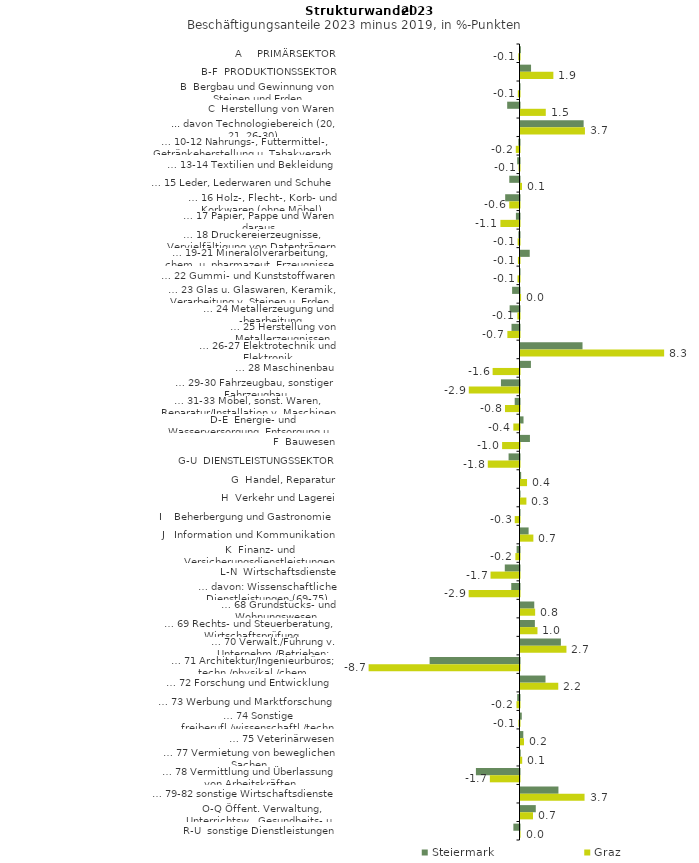
| Category | Steiermark | Graz |
|---|---|---|
| A     PRIMÄRSEKTOR | 0.022 | -0.067 |
| B-F  PRODUKTIONSSEKTOR | 0.612 | 1.905 |
| B  Bergbau und Gewinnung von Steinen und Erden | -0.009 | -0.097 |
| C  Herstellung von Waren | -0.714 | 1.466 |
| ... davon Technologiebereich (20, 21, 26-30) | 3.66 | 3.736 |
| … 10-12 Nahrungs-, Futtermittel-, Getränkeherstellung u. Tabakverarb. | -0.068 | -0.215 |
| … 13-14 Textilien und Bekleidung | -0.134 | -0.053 |
| … 15 Leder, Lederwaren und Schuhe | -0.593 | 0.089 |
| … 16 Holz-, Flecht-, Korb- und Korkwaren (ohne Möbel)  | -0.83 | -0.596 |
| … 17 Papier, Pappe und Waren daraus  | -0.208 | -1.107 |
| … 18 Druckereierzeugnisse, Vervielfältigung von Datenträgern | -0.063 | -0.106 |
| … 19-21 Mineralölverarbeitung, chem. u. pharmazeut. Erzeugnisse | 0.535 | -0.092 |
| … 22 Gummi- und Kunststoffwaren | -0.02 | -0.115 |
| … 23 Glas u. Glaswaren, Keramik, Verarbeitung v. Steinen u. Erden  | -0.429 | 0.032 |
| … 24 Metallerzeugung und -bearbeitung | -0.572 | -0.124 |
| … 25 Herstellung von Metallerzeugnissen  | -0.464 | -0.704 |
| … 26-27 Elektrotechnik und Elektronik | 3.595 | 8.327 |
| … 28 Maschinenbau | 0.604 | -1.558 |
| … 29-30 Fahrzeugbau, sonstiger Fahrzeugbau | -1.076 | -2.939 |
| … 31-33 Möbel, sonst. Waren, Reparatur/Installation v. Maschinen | -0.279 | -0.839 |
| D-E  Energie- und Wasserversorgung, Entsorgung u. Rückgewinnung | 0.175 | -0.358 |
| F  Bauwesen | 0.547 | -1.009 |
| G-U  DIENSTLEISTUNGSSEKTOR | -0.633 | -1.838 |
| G  Handel, Reparatur | 0.038 | 0.379 |
| H  Verkehr und Lagerei | -0.011 | 0.342 |
| I    Beherbergung und Gastronomie | -0.007 | -0.275 |
| J   Information und Kommunikation | 0.471 | 0.746 |
| K  Finanz- und Versicherungsdienstleistungen | -0.168 | -0.24 |
| L-N  Wirtschaftsdienste | -0.853 | -1.679 |
| … davon: Wissenschaftliche Dienstleistungen (69-75) | -0.478 | -2.948 |
| … 68 Grundstücks- und Wohnungswesen  | 0.798 | 0.849 |
| … 69 Rechts- und Steuerberatung, Wirtschaftsprüfung | 0.834 | 0.984 |
| … 70 Verwalt./Führung v. Unternehm./Betrieben; Unternehmensberat. | 2.342 | 2.663 |
| … 71 Architektur/Ingenieurbüros; techn./physikal./chem. Untersuchung | -5.212 | -8.747 |
| … 72 Forschung und Entwicklung  | 1.449 | 2.189 |
| … 73 Werbung und Marktforschung | -0.133 | -0.174 |
| … 74 Sonstige freiberufl./wissenschaftl./techn. Tätigkeiten | 0.074 | -0.062 |
| … 75 Veterinärwesen | 0.163 | 0.202 |
| … 77 Vermietung von beweglichen Sachen  | 0.011 | 0.099 |
| … 78 Vermittlung und Überlassung von Arbeitskräften | -2.527 | -1.719 |
| … 79-82 sonstige Wirtschaftsdienste | 2.199 | 3.713 |
| O-Q Öffent. Verwaltung, Unterrichtsw., Gesundheits- u. Sozialwesen | 0.886 | 0.725 |
| R-U  sonstige Dienstleistungen | -0.355 | 0.003 |